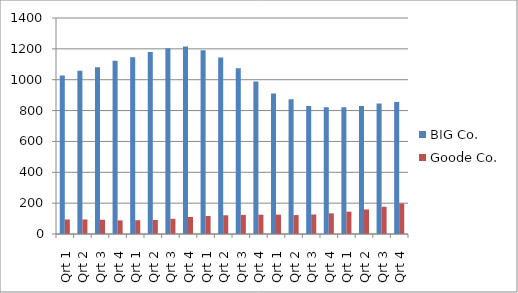
| Category | BIG Co. | Goode Co. |
|---|---|---|
| Qrt 1 | 1028 | 94 |
| Qrt 2 | 1058.84 | 94 |
| Qrt 3 | 1080.017 | 92.12 |
| Qrt 4 | 1123.217 | 88.435 |
| Qrt 1 | 1145.682 | 89.32 |
| Qrt 2 | 1180.052 | 91.106 |
| Qrt 3 | 1203.653 | 98.394 |
| Qrt 4 | 1215.69 | 110.202 |
| Qrt 1 | 1191.376 | 116.814 |
| Qrt 2 | 1143.721 | 121.486 |
| Qrt 3 | 1075.098 | 123.916 |
| Qrt 4 | 989.09 | 125.155 |
| Qrt 1 | 909.963 | 125.155 |
| Qrt 2 | 873.564 | 122.652 |
| Qrt 3 | 829.886 | 126.332 |
| Qrt 4 | 821.587 | 133.912 |
| Qrt 1 | 821.587 | 144.625 |
| Qrt 2 | 829.803 | 159.087 |
| Qrt 3 | 846.399 | 176.587 |
| Qrt 4 | 854.863 | 197.777 |